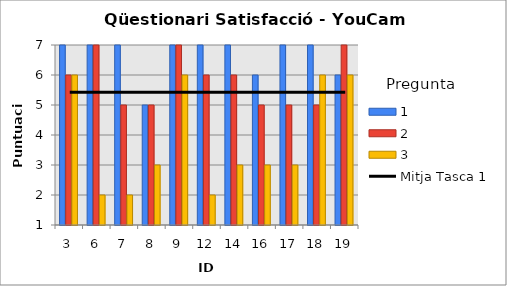
| Category | 1 | 2 | 3 |
|---|---|---|---|
| 3.0 | 7 | 6 | 6 |
| 6.0 | 7 | 7 | 2 |
| 7.0 | 7 | 5 | 2 |
| 8.0 | 5 | 5 | 3 |
| 9.0 | 7 | 7 | 6 |
| 12.0 | 7 | 6 | 2 |
| 14.0 | 7 | 6 | 3 |
| 16.0 | 6 | 5 | 3 |
| 17.0 | 7 | 5 | 3 |
| 18.0 | 7 | 5 | 6 |
| 19.0 | 6 | 7 | 6 |